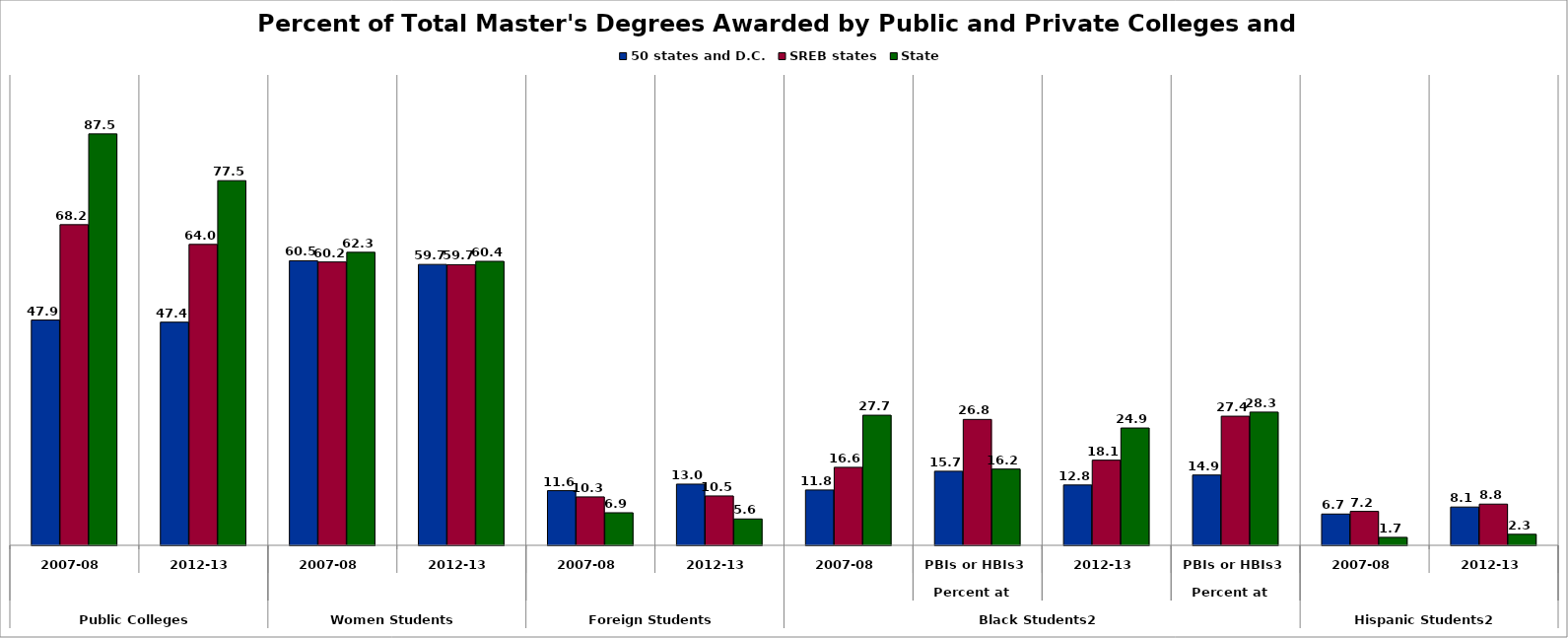
| Category | 50 states and D.C. | SREB states | State |
|---|---|---|---|
| 0 | 47.89 | 68.167 | 87.456 |
| 1 | 47.439 | 63.98 | 77.524 |
| 2 | 60.493 | 60.243 | 62.294 |
| 3 | 59.714 | 59.659 | 60.377 |
| 4 | 11.619 | 10.29 | 6.922 |
| 5 | 13.005 | 10.495 | 5.604 |
| 6 | 11.76 | 16.578 | 27.659 |
| 7 | 15.746 | 26.765 | 16.209 |
| 8 | 12.822 | 18.101 | 24.94 |
| 9 | 14.942 | 27.447 | 28.324 |
| 10 | 6.65 | 7.211 | 1.691 |
| 11 | 8.14 | 8.756 | 2.348 |